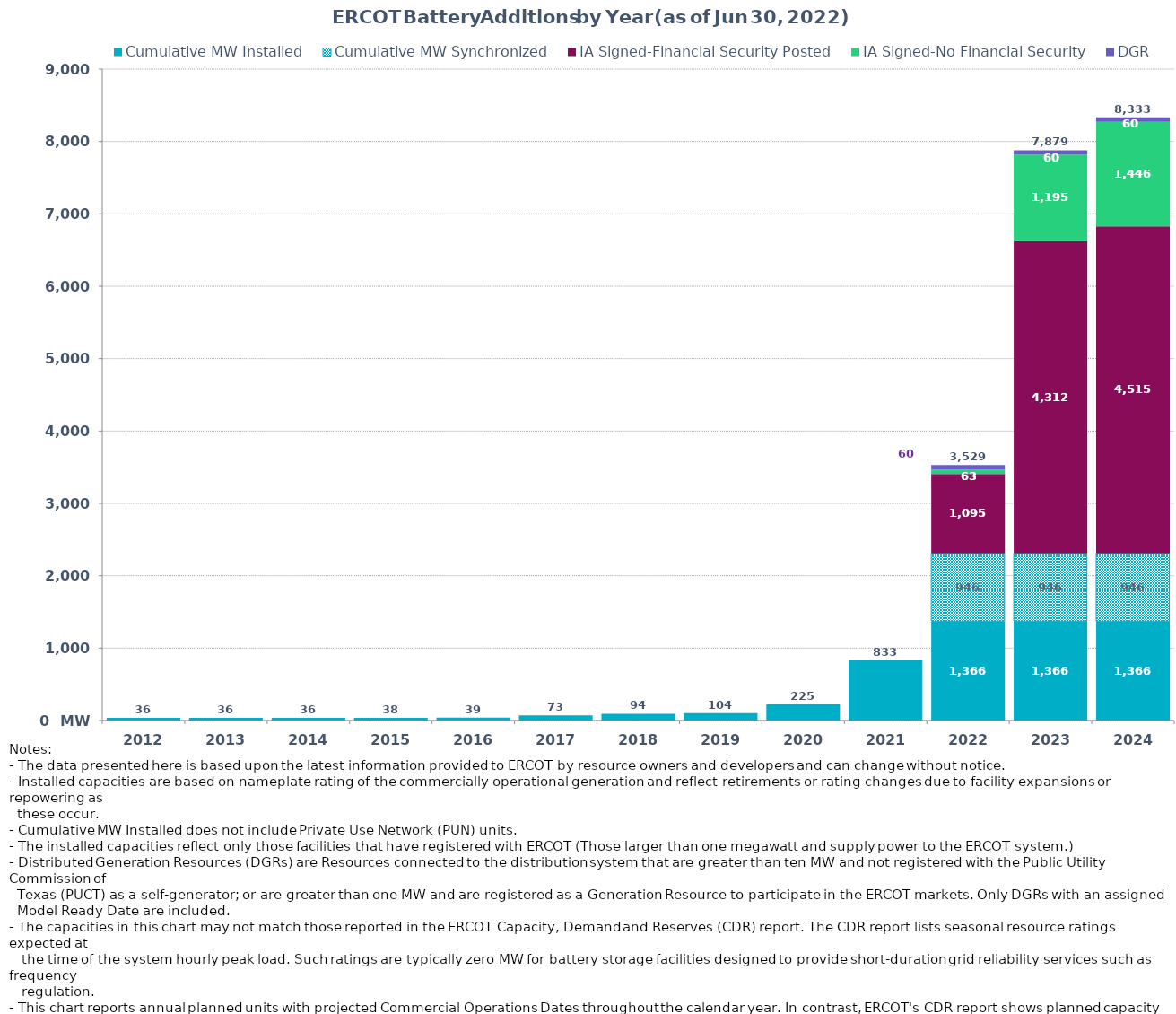
| Category | Cumulative MW Installed | Cumulative MW Synchronized | IA Signed-Financial Security Posted  | IA Signed-No Financial Security  | DGR | Cumulative Installed and Planned |
|---|---|---|---|---|---|---|
| 2012.0 | 36 | 0 | 0 | 0 | 0 | 36 |
| 2013.0 | 36 | 0 | 0 | 0 | 0 | 36 |
| 2014.0 | 36 | 0 | 0 | 0 | 0 | 36 |
| 2015.0 | 38 | 0 | 0 | 0 | 0 | 38 |
| 2016.0 | 39 | 0 | 0 | 0 | 0 | 39 |
| 2017.0 | 72.5 | 0 | 0 | 0 | 0 | 72.5 |
| 2018.0 | 93.8 | 0 | 0 | 0 | 0 | 93.8 |
| 2019.0 | 103.7 | 0 | 0 | 0 | 0 | 103.7 |
| 2020.0 | 225.4 | 0 | 0 | 0 | 0 | 225.4 |
| 2021.0 | 833.13 | 0 | 0 | 0 | 0 | 833.13 |
| 2022.0 | 1366.48 | 945.67 | 1094.59 | 62.5 | 59.7 | 3528.94 |
| 2023.0 | 1366.48 | 945.67 | 4312.09 | 1195.31 | 59.7 | 7879.25 |
| 2024.0 | 1366.48 | 945.67 | 4514.69 | 1446.14 | 59.7 | 8332.68 |